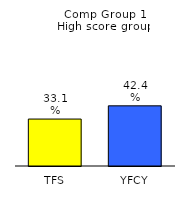
| Category | Series 0 |
|---|---|
| TFS | 0.331 |
| YFCY | 0.424 |